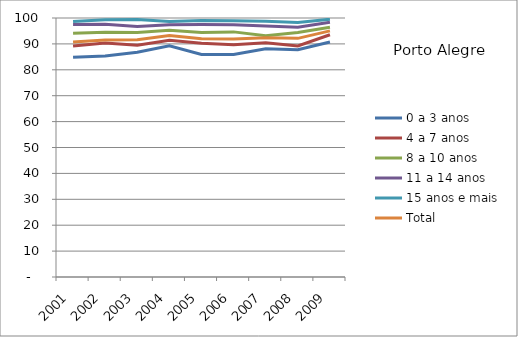
| Category | 0 a 3 anos | 4 a 7 anos | 8 a 10 anos | 11 a 14 anos | 15 anos e mais | Total |
|---|---|---|---|---|---|---|
| 2001.0 | 84.87 | 89.17 | 94.15 | 97.51 | 98.61 | 90.69 |
| 2002.0 | 85.35 | 90.35 | 94.47 | 97.58 | 99.32 | 91.48 |
| 2003.0 | 86.81 | 89.52 | 94.37 | 96.69 | 99.38 | 91.61 |
| 2004.0 | 89.25 | 91.36 | 95.26 | 97.4 | 98.61 | 93.23 |
| 2005.0 | 85.94 | 90.26 | 94.4 | 97.47 | 99.06 | 91.97 |
| 2006.0 | 85.89 | 89.69 | 94.64 | 97.38 | 98.94 | 91.93 |
| 2007.0 | 88.15 | 90.44 | 93.14 | 96.87 | 98.75 | 92.39 |
| 2008.0 | 87.77 | 89.19 | 94.41 | 96.43 | 98.3 | 92.14 |
| 2009.0 | 90.76 | 93.54 | 96.45 | 98.35 | 99.53 | 95.03 |